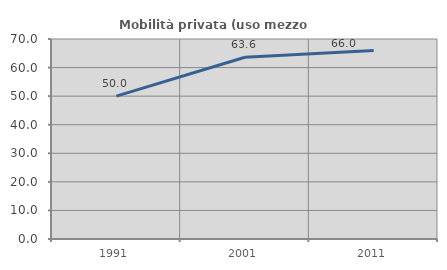
| Category | Mobilità privata (uso mezzo privato) |
|---|---|
| 1991.0 | 50.016 |
| 2001.0 | 63.595 |
| 2011.0 | 65.978 |